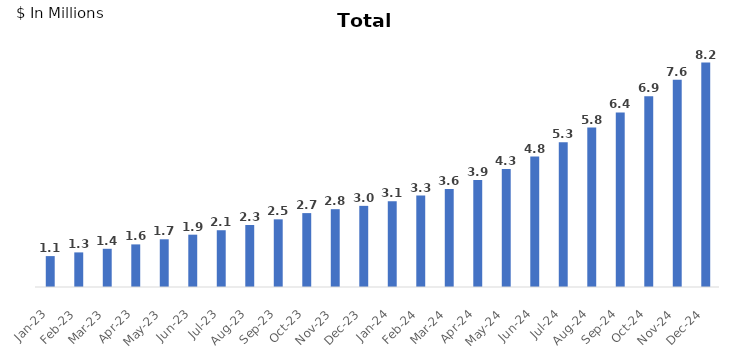
| Category | Total ARR |
|---|---|
| 2023-01-31 | 1125915.929 |
| 2023-02-28 | 1260644.902 |
| 2023-03-31 | 1392161.344 |
| 2023-04-30 | 1552491.764 |
| 2023-05-31 | 1738625.771 |
| 2023-06-30 | 1906428.218 |
| 2023-07-31 | 2068383.373 |
| 2023-08-31 | 2258261.124 |
| 2023-09-30 | 2465800.908 |
| 2023-10-31 | 2692576.581 |
| 2023-11-30 | 2835353.872 |
| 2023-12-31 | 2956511.128 |
| 2024-01-31 | 3126052.061 |
| 2024-02-29 | 3330495.749 |
| 2024-03-31 | 3571792.774 |
| 2024-04-30 | 3896062.017 |
| 2024-05-31 | 4302085.645 |
| 2024-06-30 | 4754293.132 |
| 2024-07-31 | 5272707.373 |
| 2024-08-31 | 5808071.128 |
| 2024-09-30 | 6360282.702 |
| 2024-10-31 | 6949301.006 |
| 2024-11-30 | 7554845.199 |
| 2024-12-31 | 8176816.128 |